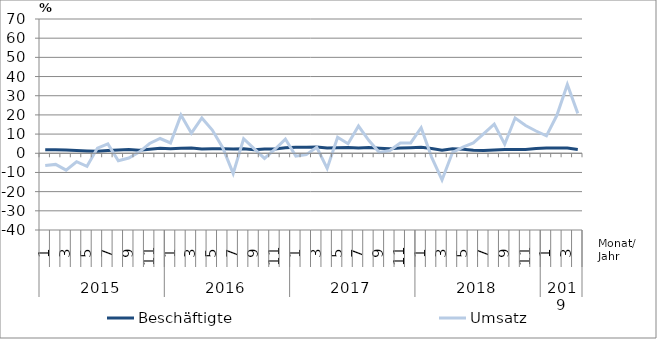
| Category | Beschäftigte | Umsatz |
|---|---|---|
| 0 | 1.8 | -6.4 |
| 1 | 1.8 | -5.8 |
| 2 | 1.7 | -8.8 |
| 3 | 1.5 | -4.4 |
| 4 | 1.2 | -6.8 |
| 5 | 1 | 2.7 |
| 6 | 1.4 | 4.9 |
| 7 | 1.7 | -3.9 |
| 8 | 2 | -2.5 |
| 9 | 1.6 | 0.6 |
| 10 | 2.1 | 5.1 |
| 11 | 2.6 | 7.7 |
| 12 | 2.4 | 5.4 |
| 13 | 2.6 | 19.9 |
| 14 | 2.7 | 10.5 |
| 15 | 2.2 | 18.4 |
| 16 | 2.3 | 12.1 |
| 17 | 2.3 | 2.9 |
| 18 | 2.2 | -10.5 |
| 19 | 2.4 | 7.6 |
| 20 | 1.8 | 2.4 |
| 21 | 2.2 | -2.7 |
| 22 | 2.2 | 2.1 |
| 23 | 2.9 | 7.4 |
| 24 | 3.2 | -1.5 |
| 25 | 3.2 | -0.7 |
| 26 | 3.3 | 3.1 |
| 27 | 2.7 | -7.9 |
| 28 | 2.9 | 8.4 |
| 29 | 3 | 5 |
| 30 | 2.8 | 14.2 |
| 31 | 3 | 6.6 |
| 32 | 2.6 | 0.4 |
| 33 | 2.3 | 1.4 |
| 34 | 2.7 | 5.3 |
| 35 | 2.9 | 5.4 |
| 36 | 3.1 | 13.3 |
| 37 | 2.5 | -2 |
| 38 | 1.6 | -13.9 |
| 39 | 2.4 | 0.4 |
| 40 | 2.1 | 3.2 |
| 41 | 1.6 | 5.4 |
| 42 | 1.5 | 10.3 |
| 43 | 1.7 | 15.2 |
| 44 | 2 | 4.7 |
| 45 | 2 | 18.4 |
| 46 | 2 | 14.5 |
| 47 | 2.5 | 11.6 |
| 48 | 2.7 | 9.1 |
| 49 | 2.8 | 19.8 |
| 50 | 2.8 | 35.8 |
| 51 | 2 | 20.8 |